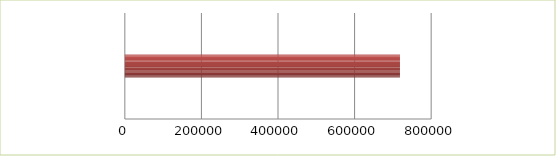
| Category | Series 0 | Series 1 |
|---|---|---|
| 0 | 2.5 | 0 |
| 1 | 2.6 | 718530 |
| 2 | 2.7 | 0 |